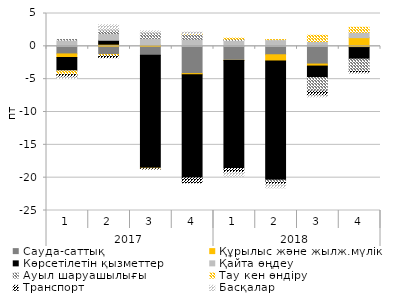
| Category | Сауда-саттық | Құрылыс және жылж.мүлік  | Көрсетілетін қызметтер  | Қайта өңдеу  | Ауыл шаруашылығы  | Тау кен өндіру  | Транспорт | Басқалар |
|---|---|---|---|---|---|---|---|---|
| 0 | -1.155 | -0.545 | -2.022 | 0.94 | 0.104 | -0.583 | -0.364 | -0.23 |
| 1 | -1.25 | 0.325 | 0.595 | 1.015 | 0.552 | -0.222 | -0.254 | 0.794 |
| 2 | -1.359 | 0.229 | -17.197 | 0.953 | 0.883 | -0.071 | -0.051 | 0.283 |
| 3 | -4.152 | -0.182 | -15.707 | 1.076 | 0.758 | 0.08 | -0.742 | 0.248 |
| 4 | -2.136 | -0.01 | -16.464 | 0.915 | 0.17 | 0.168 | -0.613 | -0.553 |
| 5 | -1.283 | -0.944 | -18.147 | 1.02 | -0.334 | 0.005 | -0.296 | -0.538 |
| 6 | -2.7 | -0.306 | -1.736 | 0.739 | -2.048 | 0.956 | -0.703 | -0.22 |
| 7 | -0.196 | 1.321 | -1.754 | 0.805 | -1.877 | 0.769 | -0.221 | -0.053 |